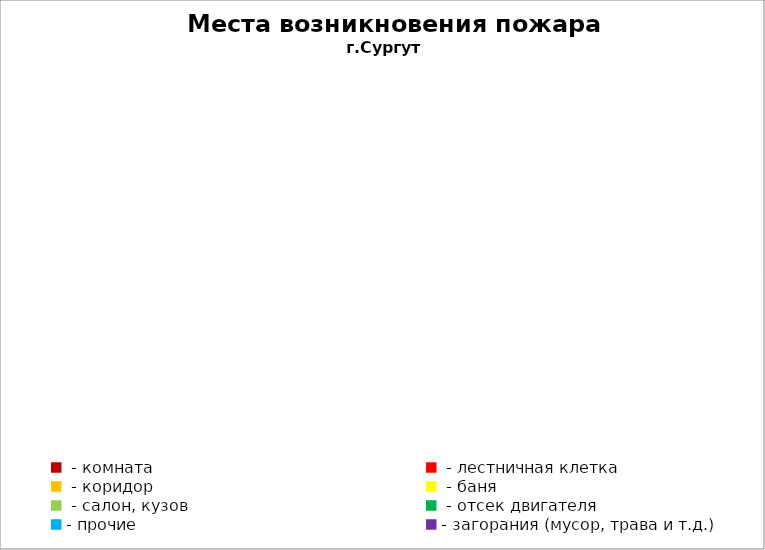
| Category | Места возникновения пожара |
|---|---|
|  - комната | 50 |
|  - лестничная клетка | 9 |
|  - коридор | 8 |
|  - баня | 26 |
|  - салон, кузов | 15 |
|  - отсек двигателя | 31 |
| - прочие | 67 |
| - загорания (мусор, трава и т.д.)  | 131 |